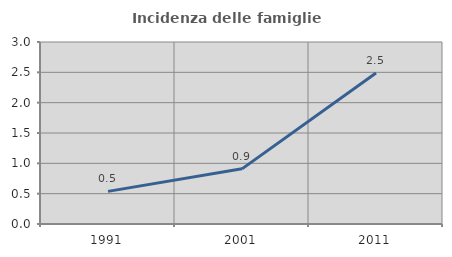
| Category | Incidenza delle famiglie numerose |
|---|---|
| 1991.0 | 0.538 |
| 2001.0 | 0.909 |
| 2011.0 | 2.49 |